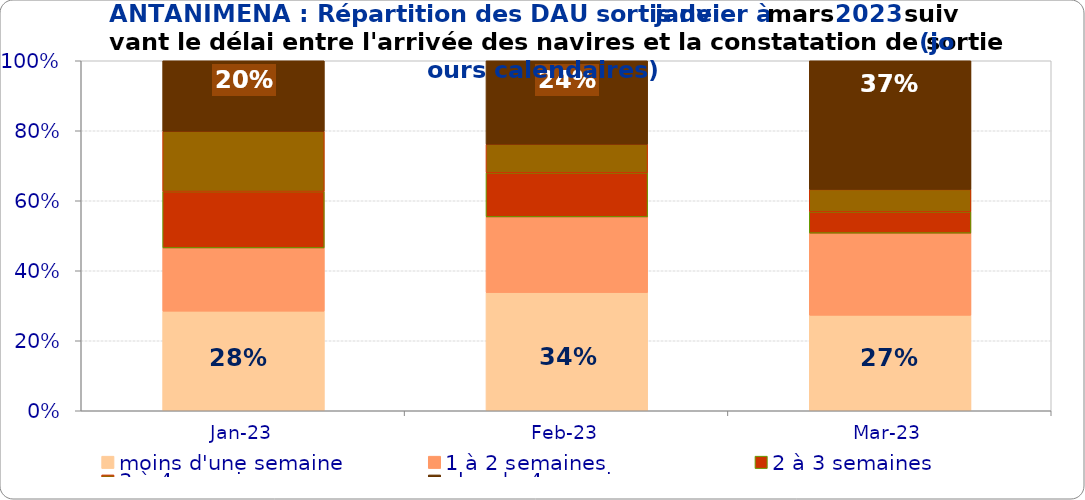
| Category | moins d'une semaine | 1 à 2 semaines | 2 à 3 semaines | 3 à 4 semaines | plus de 4 semaines |
|---|---|---|---|---|---|
| 2023-01-01 | 0.285 | 0.181 | 0.161 | 0.172 | 0.201 |
| 2023-02-01 | 0.338 | 0.216 | 0.126 | 0.082 | 0.238 |
| 2023-03-01 | 0.273 | 0.235 | 0.061 | 0.064 | 0.368 |